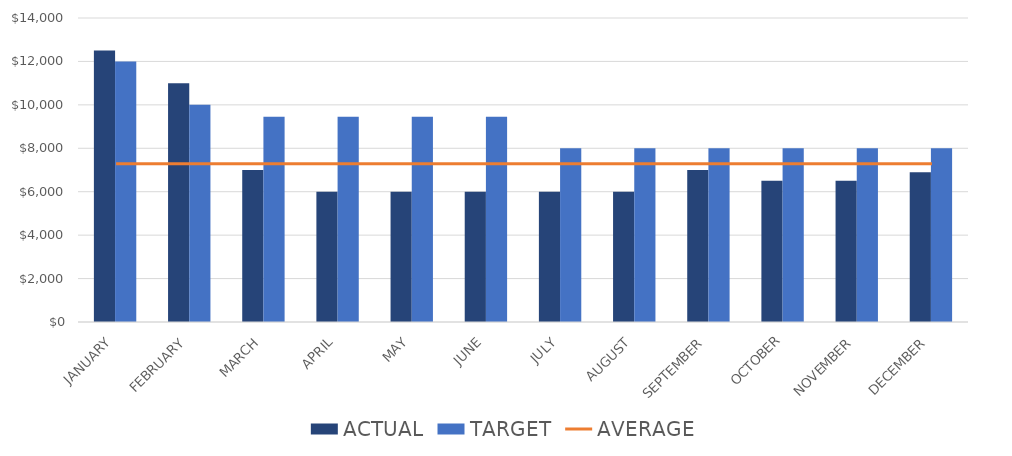
| Category | ACTUAL | TARGET |
|---|---|---|
| JANUARY | 12500 | 12000 |
| FEBRUARY | 11000 | 10000 |
| MARCH | 7000 | 9450 |
| APRIL | 6000 | 9450 |
| MAY | 6000 | 9450 |
| JUNE | 6000 | 9450 |
| JULY | 6000 | 8000 |
| AUGUST | 6000 | 8000 |
| SEPTEMBER | 7000 | 8000 |
| OCTOBER | 6500 | 8000 |
| NOVEMBER | 6500 | 8000 |
| DECEMBER | 6900 | 8000 |